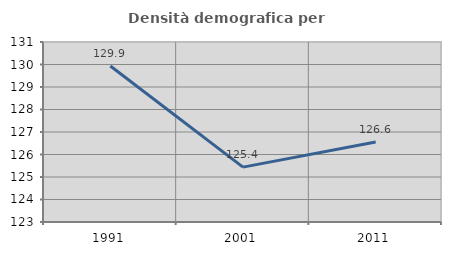
| Category | Densità demografica |
|---|---|
| 1991.0 | 129.935 |
| 2001.0 | 125.44 |
| 2011.0 | 126.558 |